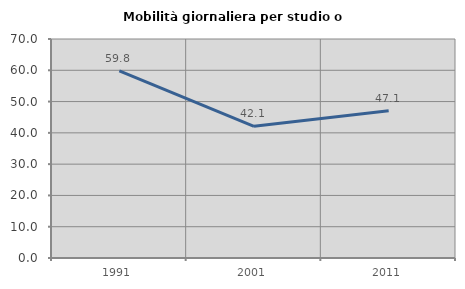
| Category | Mobilità giornaliera per studio o lavoro |
|---|---|
| 1991.0 | 59.817 |
| 2001.0 | 42.077 |
| 2011.0 | 47.059 |